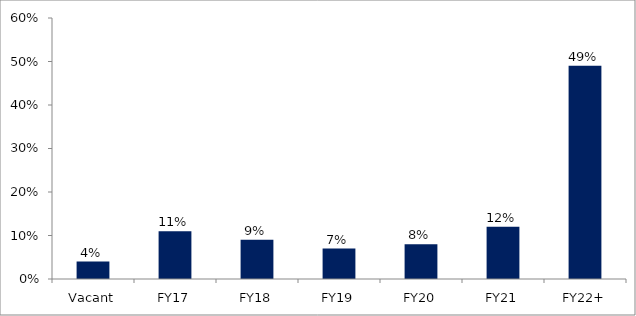
| Category | Series 0 |
|---|---|
| Vacant | 0.04 |
| FY17 | 0.11 |
| FY18 | 0.09 |
| FY19 | 0.07 |
| FY20 | 0.08 |
| FY21 | 0.12 |
| FY22+ | 0.49 |